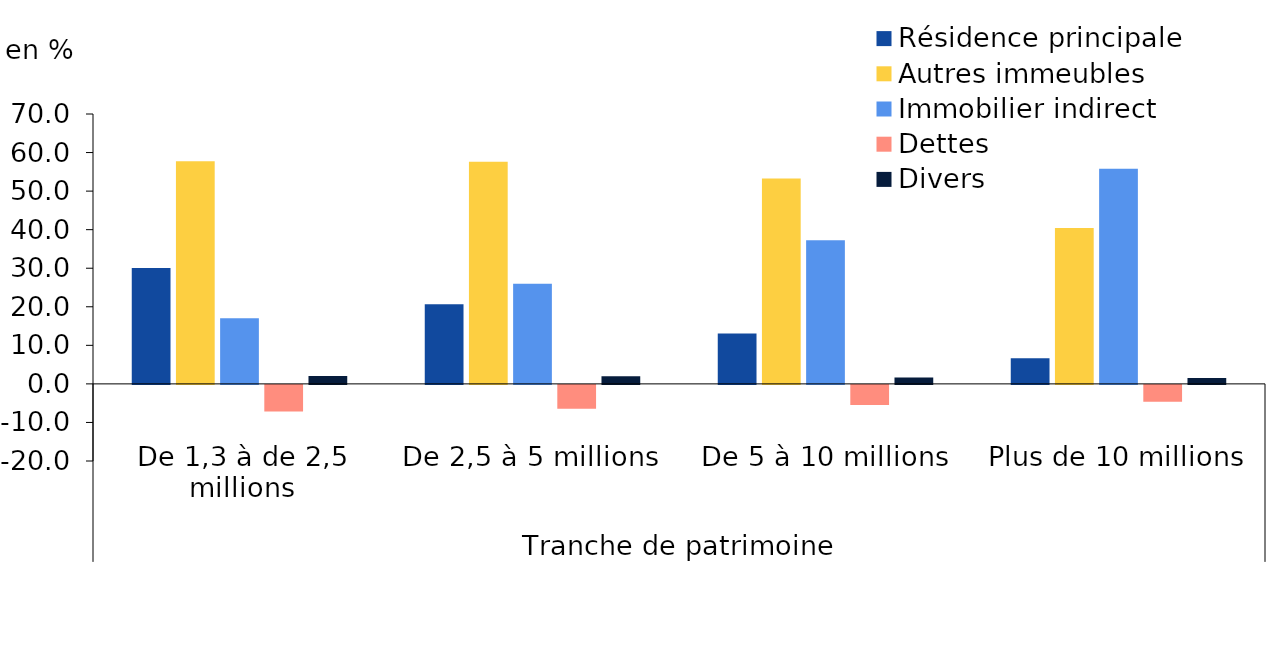
| Category | Résidence principale | Autres immeubles | Immobilier indirect | Dettes | Divers |
|---|---|---|---|---|---|
| 0 | 30.071 | 57.751 | 17.011 | -6.884 | 2.051 |
| 1 | 20.635 | 57.605 | 25.946 | -6.161 | 1.975 |
| 2 | 13.066 | 53.242 | 37.263 | -5.209 | 1.637 |
| 3 | 6.628 | 40.422 | 55.803 | -4.392 | 1.541 |